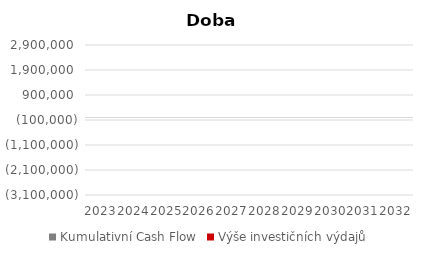
| Category | Kumulativní Cash Flow | Výše investičních výdajů |
|---|---|---|
| 2023 | 0 | 0 |
| 2024 | 0 | 0 |
| 2025 | 0 | 0 |
| 2026 | 0 | 0 |
| 2027 | 0 | 0 |
| 2028 | 0 | 0 |
| 2029 | 0 | 0 |
| 2030 | 0 | 0 |
| 2031 | 0 | 0 |
| 2032 | 0 | 0 |